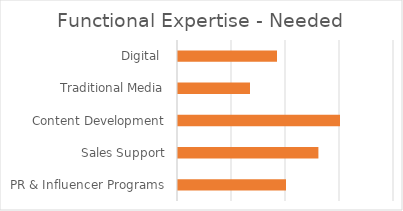
| Category | Needed |
|---|---|
| PR & Influencer Programs | 2 |
| Sales Support | 2.6 |
| Content Development | 3 |
| Traditional Media | 1.333 |
| Digital  | 1.833 |